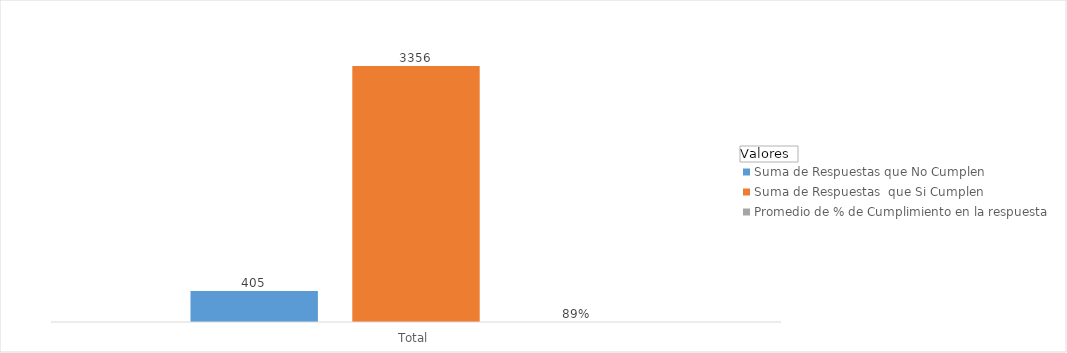
| Category | Suma de Respuestas que No Cumplen  | Suma de Respuestas  que Si Cumplen | Promedio de % de Cumplimiento en la respuesta |
|---|---|---|---|
| Total | 405 | 3356 | 0.892 |